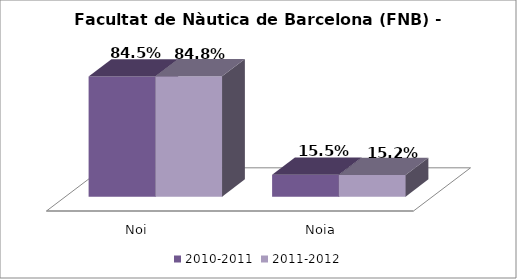
| Category | 2010-2011 | 2011-2012 |
|---|---|---|
| Noi | 0.845 | 0.848 |
| Noia | 0.155 | 0.152 |